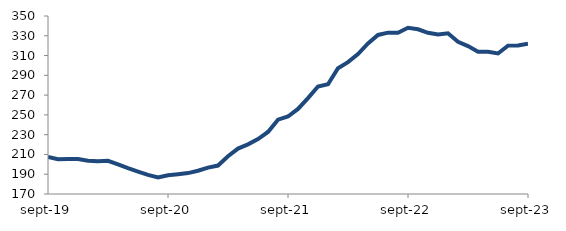
| Category | Series 0 |
|---|---|
| 2019-09-01 | 207.556 |
| 2019-10-01 | 205.179 |
| 2019-11-01 | 205.444 |
| 2019-12-01 | 205.45 |
| 2020-01-01 | 203.595 |
| 2020-02-01 | 202.996 |
| 2020-03-01 | 203.606 |
| 2020-04-01 | 199.997 |
| 2020-05-01 | 196.129 |
| 2020-06-01 | 192.644 |
| 2020-07-01 | 189.309 |
| 2020-08-01 | 186.635 |
| 2020-09-01 | 188.903 |
| 2020-10-01 | 189.967 |
| 2020-11-01 | 191.14 |
| 2020-12-01 | 193.522 |
| 2021-01-01 | 196.705 |
| 2021-02-01 | 198.76 |
| 2021-03-01 | 208.155 |
| 2021-04-01 | 215.916 |
| 2021-05-01 | 220.213 |
| 2021-06-01 | 225.532 |
| 2021-07-01 | 232.751 |
| 2021-08-01 | 245.217 |
| 2021-09-01 | 248.367 |
| 2021-10-01 | 256.011 |
| 2021-11-01 | 267.005 |
| 2021-12-01 | 278.738 |
| 2022-01-01 | 281.024 |
| 2022-02-01 | 297.23 |
| 2022-03-01 | 303.362 |
| 2022-04-01 | 311.514 |
| 2022-05-01 | 322.269 |
| 2022-06-01 | 330.847 |
| 2022-07-01 | 333.173 |
| 2022-08-01 | 333.056 |
| 2022-09-01 | 338.053 |
| 2022-10-01 | 336.541 |
| 2022-11-01 | 333.017 |
| 2022-12-01 | 331.349 |
| 2023-01-01 | 332.533 |
| 2023-02-01 | 323.969 |
| 2023-03-01 | 319.613 |
| 2023-04-01 | 313.925 |
| 2023-05-01 | 313.735 |
| 2023-06-01 | 312.115 |
| 2023-07-01 | 320.047 |
| 2023-08-01 | 320.242 |
| 2023-09-01 | 322.058 |